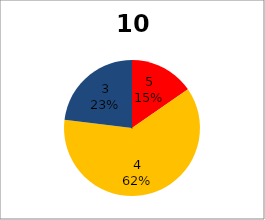
| Category | Series 0 |
|---|---|
| 5.0 | 2 |
| 4.0 | 8 |
| 3.0 | 3 |